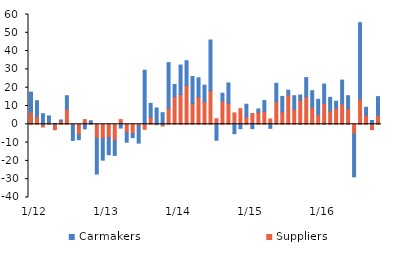
| Category | Suppliers | Carmakers |
|---|---|---|
|   1/12 | 6.642 | 10.901 |
| 2 | 4.222 | 8.675 |
| 3 | -1.481 | 5.802 |
| 4 | 1.103 | 3.466 |
| 5 | -2.985 | 0.473 |
| 6 | 1.931 | 0.415 |
| 7 | 8.339 | 7.284 |
| 8 | -0.562 | -8.229 |
| 9 | -5.745 | -2.672 |
| 10 | 2.557 | -2.514 |
| 11 | 0.609 | 1.317 |
| 12 | -7.728 | -19.471 |
|   1/13 | -7.916 | -11.675 |
| 2 | -7.235 | -9.413 |
| 3 | -9.14 | -7.836 |
| 4 | 2.548 | -2.064 |
| 5 | -4.601 | -5.181 |
| 6 | -5.176 | -2.102 |
| 7 | -0.994 | -9.299 |
| 8 | -2.73 | 29.557 |
| 9 | 3.843 | 7.569 |
| 10 | -0.247 | 8.934 |
| 11 | -0.885 | 6.341 |
| 12 | 8.759 | 24.947 |
|   1/14 | 15.099 | 6.679 |
| 2 | 16.326 | 16.05 |
| 3 | 21.14 | 13.592 |
| 4 | 11.349 | 14.776 |
| 5 | 14.919 | 10.505 |
| 6 | 12.315 | 9.068 |
| 7 | 18.43 | 27.627 |
| 8 | 3.059 | -8.698 |
| 9 | 12.792 | 4.184 |
| 10 | 11.41 | 11.194 |
| 11 | 6.223 | -5.134 |
| 12 | 8.519 | -2.43 |
|   1/15 | 4.079 | 6.883 |
| 2 | 5.928 | -2.39 |
| 3 | 6.653 | 1.741 |
| 4 | 7.06 | 5.904 |
| 5 | 2.899 | -2.201 |
| 6 | 12.467 | 9.925 |
| 7 | 6.763 | 8.482 |
| 8 | 16.018 | 2.627 |
| 9 | 8.234 | 7.373 |
| 10 | 13.125 | 2.881 |
| 11 | 15.02 | 10.508 |
| 12 | 9.239 | 9.124 |
|   1/16 | 5.326 | 8.31 |
| 2 | 11.428 | 10.548 |
| 3 | 7.323 | 7.396 |
| 4 | 8.88 | 3.747 |
| 5 | 11.064 | 13.076 |
| 6 | 8.425 | 7.179 |
| 7 | -5.388 | -23.319 |
| 8 | 13.851 | 41.682 |
| 9 | 4.965 | 4.303 |
| 10 | -2.932 | 2.107 |
| 11 | 4.844 | 10.278 |